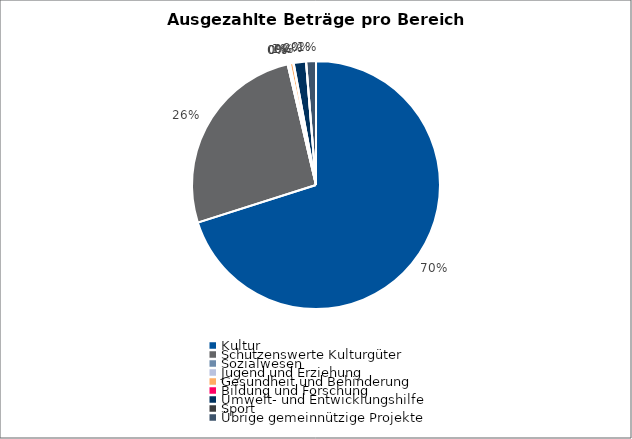
| Category | Series 0 |
|---|---|
| Kultur | 6680492 |
| Schützenswerte Kulturgüter | 2500000 |
| Sozialwesen | 0 |
| Jugend und Erziehung | 26500 |
| Gesundheit und Behinderung | 43000 |
| Bildung und Forschung | 5000 |
| Umwelt- und Entwicklungshilfe | 153000 |
| Sport | 0 |
| Übrige gemeinnützige Projekte | 122500 |